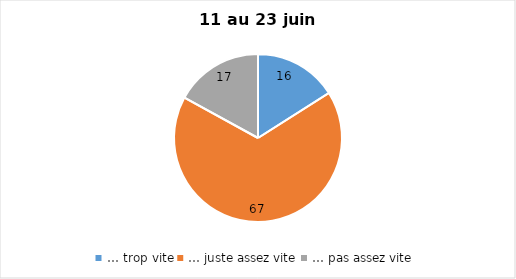
| Category | Series 0 |
|---|---|
| … trop vite | 16 |
| … juste assez vite | 67 |
| … pas assez vite | 17 |